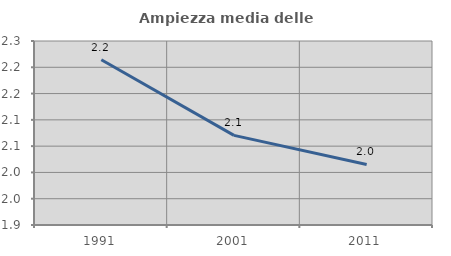
| Category | Ampiezza media delle famiglie |
|---|---|
| 1991.0 | 2.214 |
| 2001.0 | 2.07 |
| 2011.0 | 2.015 |